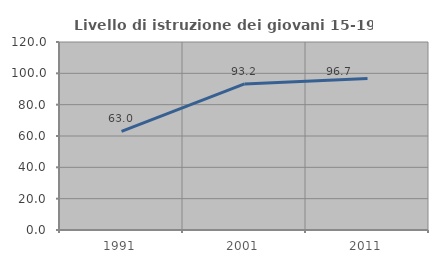
| Category | Livello di istruzione dei giovani 15-19 anni |
|---|---|
| 1991.0 | 62.998 |
| 2001.0 | 93.243 |
| 2011.0 | 96.748 |